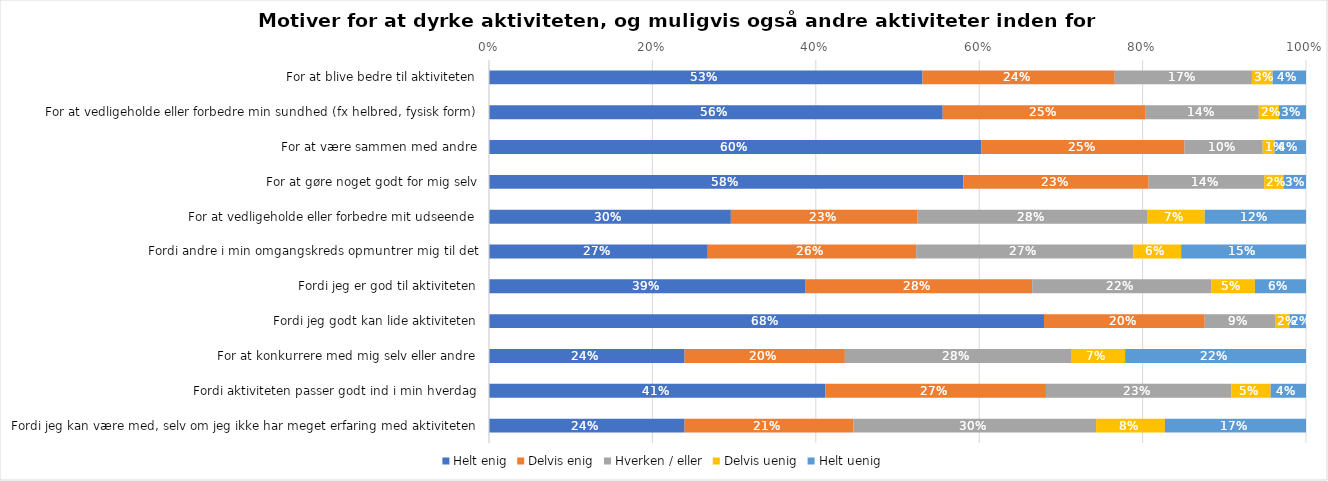
| Category | Helt enig | Delvis enig | Hverken / eller | Delvis uenig | Helt uenig |
|---|---|---|---|---|---|
| For at blive bedre til aktiviteten | 0.531 | 0.235 | 0.168 | 0.025 | 0.041 |
| For at vedligeholde eller forbedre min sundhed (fx helbred, fysisk form) | 0.555 | 0.248 | 0.138 | 0.025 | 0.033 |
| For at være sammen med andre | 0.603 | 0.248 | 0.096 | 0.014 | 0.039 |
| For at gøre noget godt for mig selv | 0.581 | 0.227 | 0.141 | 0.023 | 0.028 |
| For at vedligeholde eller forbedre mit udseende | 0.296 | 0.228 | 0.282 | 0.07 | 0.124 |
| Fordi andre i min omgangskreds opmuntrer mig til det | 0.268 | 0.255 | 0.266 | 0.058 | 0.153 |
| Fordi jeg er god til aktiviteten | 0.387 | 0.278 | 0.219 | 0.054 | 0.063 |
| Fordi jeg godt kan lide aktiviteten | 0.679 | 0.197 | 0.086 | 0.017 | 0.02 |
| For at konkurrere med mig selv eller andre | 0.239 | 0.196 | 0.277 | 0.066 | 0.221 |
| Fordi aktiviteten passer godt ind i min hverdag | 0.412 | 0.27 | 0.227 | 0.048 | 0.043 |
| Fordi jeg kan være med, selv om jeg ikke har meget erfaring med aktiviteten | 0.239 | 0.206 | 0.297 | 0.084 | 0.173 |